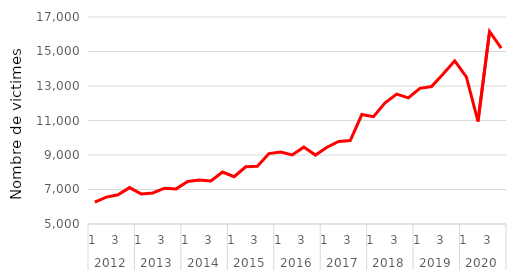
| Category | Série CVS-CJO |
|---|---|
| 0 | 6263.729 |
| 1 | 6560.985 |
| 2 | 6690.12 |
| 3 | 7109.72 |
| 4 | 6740.588 |
| 5 | 6796.578 |
| 6 | 7076.26 |
| 7 | 7035.615 |
| 8 | 7461.105 |
| 9 | 7553.69 |
| 10 | 7492.784 |
| 11 | 8013.555 |
| 12 | 7739.261 |
| 13 | 8315.087 |
| 14 | 8343.121 |
| 15 | 9082.768 |
| 16 | 9167.699 |
| 17 | 9004.924 |
| 18 | 9456.279 |
| 19 | 8994.709 |
| 20 | 9448.54 |
| 21 | 9780.909 |
| 22 | 9839.735 |
| 23 | 11345.176 |
| 24 | 11219.677 |
| 25 | 12021.021 |
| 26 | 12530.851 |
| 27 | 12314.019 |
| 28 | 12866.919 |
| 29 | 12970.568 |
| 30 | 13691.752 |
| 31 | 14461.303 |
| 32 | 13526.084 |
| 33 | 10943.848 |
| 34 | 16163.448 |
| 35 | 15194.326 |